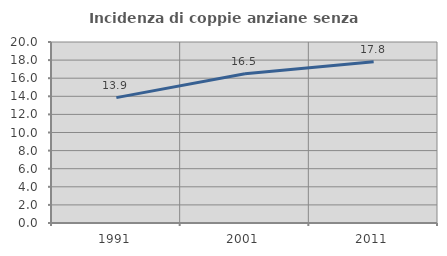
| Category | Incidenza di coppie anziane senza figli  |
|---|---|
| 1991.0 | 13.856 |
| 2001.0 | 16.501 |
| 2011.0 | 17.818 |